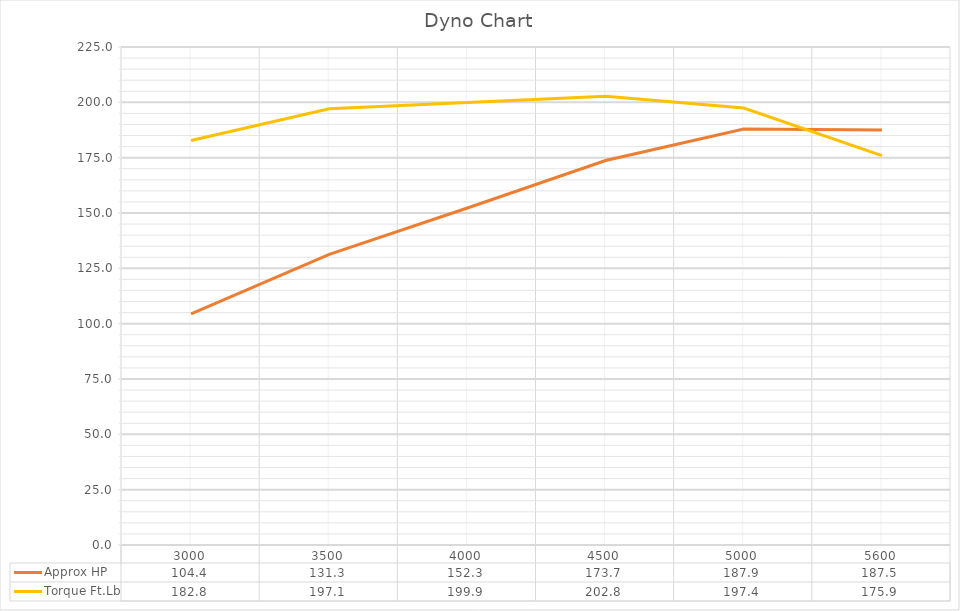
| Category | Approx HP | Torque Ft.Lb |
|---|---|---|
| 3000.0 | 104.406 | 182.784 |
| 3500.0 | 131.323 | 197.064 |
| 4000.0 | 152.259 | 199.92 |
| 4500.0 | 173.739 | 202.777 |
| 5000.0 | 187.925 | 197.4 |
| 5600.0 | 187.547 | 175.896 |